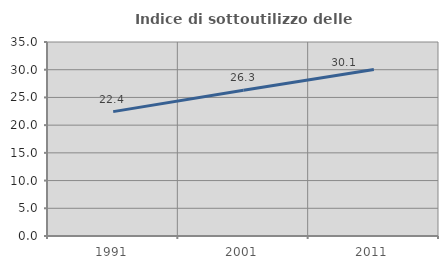
| Category | Indice di sottoutilizzo delle abitazioni  |
|---|---|
| 1991.0 | 22.439 |
| 2001.0 | 26.295 |
| 2011.0 | 30.051 |